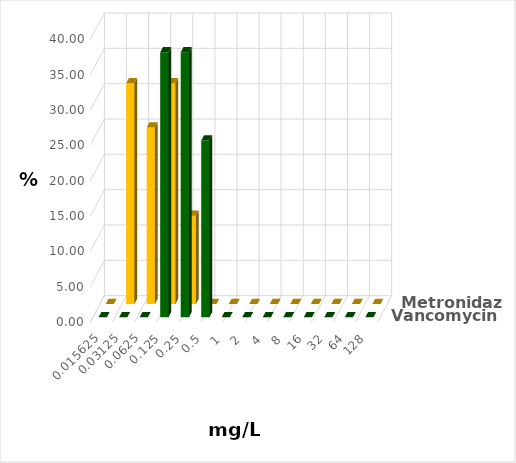
| Category | Vancomycin | Metronidazol |
|---|---|---|
| 0.015625 | 0 | 0 |
| 0.03125 | 0 | 31.25 |
| 0.0625 | 0 | 25 |
| 0.125 | 37.5 | 31.25 |
| 0.25 | 37.5 | 12.5 |
| 0.5 | 25 | 0 |
| 1.0 | 0 | 0 |
| 2.0 | 0 | 0 |
| 4.0 | 0 | 0 |
| 8.0 | 0 | 0 |
| 16.0 | 0 | 0 |
| 32.0 | 0 | 0 |
| 64.0 | 0 | 0 |
| 128.0 | 0 | 0 |